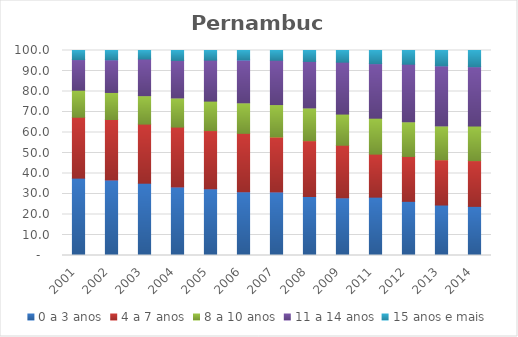
| Category | 0 a 3 anos | 4 a 7 anos | 8 a 10 anos | 11 a 14 anos | 15 anos e mais |
|---|---|---|---|---|---|
| 2001.0 | 37.74 | 29.71 | 13.18 | 14.94 | 4.44 |
| 2002.0 | 36.85 | 29.48 | 13.21 | 15.94 | 4.52 |
| 2003.0 | 35.26 | 28.83 | 13.87 | 17.89 | 4.16 |
| 2004.0 | 33.46 | 29.18 | 14.2 | 18.32 | 4.83 |
| 2005.0 | 32.56 | 28.38 | 14.37 | 19.99 | 4.69 |
| 2006.0 | 31.1 | 28.49 | 14.88 | 20.92 | 4.61 |
| 2007.0 | 31.02 | 26.8 | 15.79 | 21.64 | 4.75 |
| 2008.0 | 28.78 | 27.23 | 15.97 | 22.7 | 5.32 |
| 2009.0 | 28.15 | 25.63 | 15.21 | 25.32 | 5.69 |
| 2011.0 | 28.46 | 20.99 | 17.53 | 26.61 | 6.41 |
| 2012.0 | 26.42 | 21.9 | 16.9 | 28.1 | 6.68 |
| 2013.0 | 24.62 | 22.08 | 16.5 | 29.33 | 7.46 |
| 2014.0 | 23.96 | 22.33 | 16.87 | 28.94 | 7.9 |